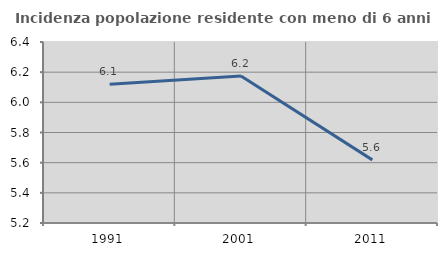
| Category | Incidenza popolazione residente con meno di 6 anni |
|---|---|
| 1991.0 | 6.12 |
| 2001.0 | 6.174 |
| 2011.0 | 5.619 |